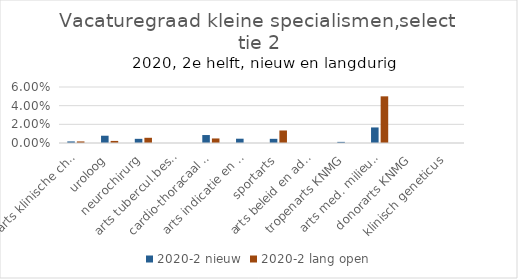
| Category | 2020-2 |
|---|---|
| arts klinische chemie | 0.002 |
| uroloog | 0.002 |
| neurochirurg | 0.006 |
| arts tubercul.bestr. KNMG | 0 |
| cardio-thoracaal chirurg | 0.005 |
| arts indicatie en advies KNMG | 0 |
| sportarts | 0.013 |
| arts beleid en advies KNMG | 0 |
| tropenarts KNMG | 0 |
| arts med. milieuk. KNMG | 0.05 |
| donorarts KNMG | 0 |
| klinisch geneticus | 0 |